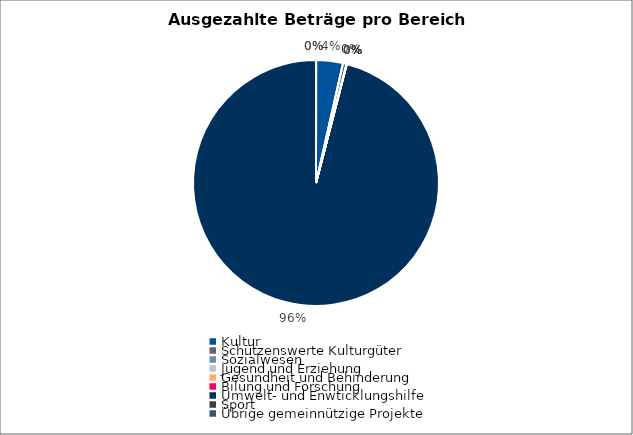
| Category | Series 0 |
|---|---|
| Kultur | 80000 |
| Schützenswerte Kulturgüter | 11000 |
| Sozialwesen | 0 |
| Jugend und Erziehung | 0 |
| Gesundheit und Behinderung | 0 |
| Bilung und Forschung | 0 |
| Umwelt- und Enwticklungshilfe | 2174510 |
| Sport | 0 |
| Übrige gemeinnützige Projekte | 0 |